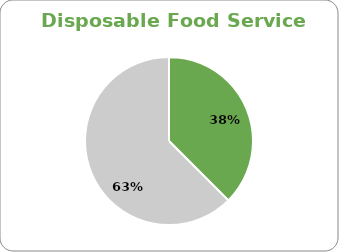
| Category | Series 0 |
|---|---|
| Sub-Total EPP | 3 |
| Sub-Total Non EPP | 5 |